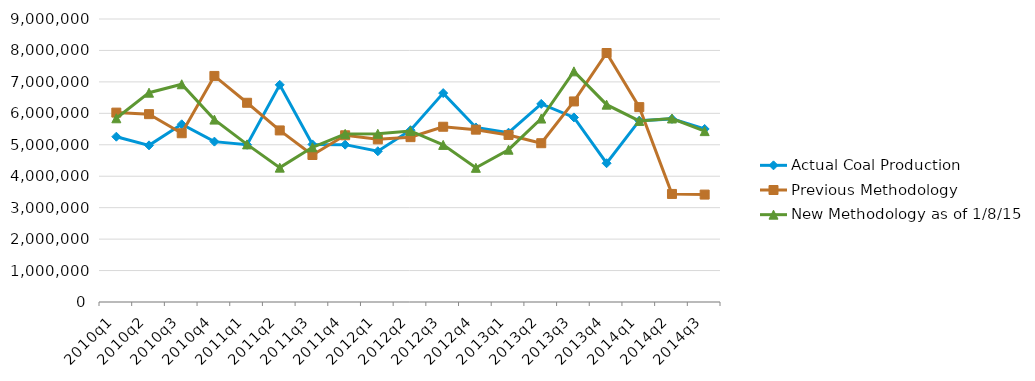
| Category | Actual Coal Production | Previous Methodology | New Methodology as of 1/8/15 |
|---|---|---|---|
| 2010q1 | 5256981 | 6022888 | 5842671 |
| 2010q2 | 4981842 | 5974103 | 6656680 |
| 2010q3 | 5651414 | 5366895 | 6924449 |
| 2010q4 | 5100351 | 7189499 | 5800750 |
| 2011q1 | 5000431 | 6335796 | 5012610 |
| 2011q2 | 6906309 | 5456202 | 4273221 |
| 2011q3 | 5011476 | 4674784 | 4921487 |
| 2011q4 | 5004241 | 5301627 | 5346443 |
| 2012q1 | 4794584 | 5172308 | 5349866 |
| 2012q2 | 5463383 | 5242802 | 5441158 |
| 2012q3 | 6643524 | 5573711 | 4996682 |
| 2012q4 | 5550784 | 5480912 | 4267173 |
| 2013q1 | 5384774 | 5312123 | 4843831 |
| 2013q2 | 6300125 | 5049964 | 5833965 |
| 2013q3 | 5870424 | 6378190 | 7335124 |
| 2013q4 | 4413318 | 7918439 | 6276010 |
| 2014q1 | 5767140 | 6197339 | 5757932 |
| 2014q2 | 5823471 | 3436539 | 5836256 |
| 2014q3 | 5502306 | 3415772 | 5434307 |